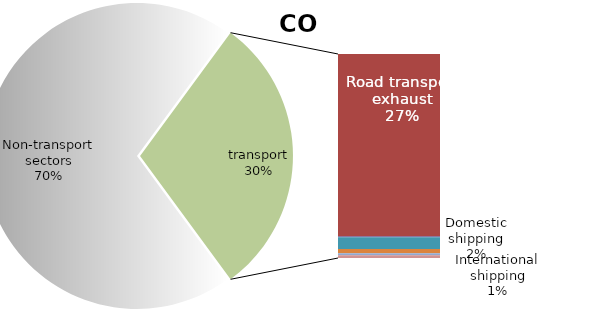
| Category | Series 0 |
|---|---|
| Non-transport sectors | 19504.994 |
| Road transport exhaust | 7409.158 |
| Road transport non-exhaust | 0 |
| Railways | 45.356 |
| Domestic shipping | 472.122 |
| International shipping | 179.613 |
| Domestic aviation | 82.842 |
| International aviation | 107.753 |